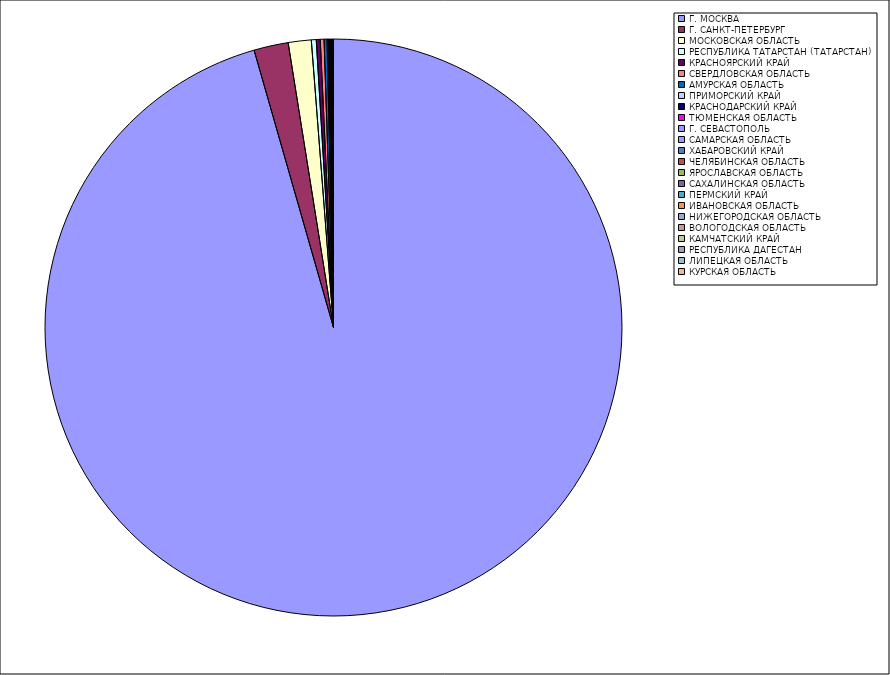
| Category | Оборот |
|---|---|
| Г. МОСКВА | 95.502 |
| Г. САНКТ-ПЕТЕРБУРГ | 1.924 |
| МОСКОВСКАЯ ОБЛАСТЬ | 1.285 |
| РЕСПУБЛИКА ТАТАРСТАН (ТАТАРСТАН) | 0.274 |
| КРАСНОЯРСКИЙ КРАЙ | 0.221 |
| СВЕРДЛОВСКАЯ ОБЛАСТЬ | 0.21 |
| АМУРСКАЯ ОБЛАСТЬ | 0.165 |
| ПРИМОРСКИЙ КРАЙ | 0.054 |
| КРАСНОДАРСКИЙ КРАЙ | 0.046 |
| ТЮМЕНСКАЯ ОБЛАСТЬ | 0.043 |
| Г. СЕВАСТОПОЛЬ | 0.033 |
| САМАРСКАЯ ОБЛАСТЬ | 0.032 |
| ХАБАРОВСКИЙ КРАЙ | 0.026 |
| ЧЕЛЯБИНСКАЯ ОБЛАСТЬ | 0.02 |
| ЯРОСЛАВСКАЯ ОБЛАСТЬ | 0.018 |
| САХАЛИНСКАЯ ОБЛАСТЬ | 0.017 |
| ПЕРМСКИЙ КРАЙ | 0.012 |
| ИВАНОВСКАЯ ОБЛАСТЬ | 0.01 |
| НИЖЕГОРОДСКАЯ ОБЛАСТЬ | 0.009 |
| ВОЛОГОДСКАЯ ОБЛАСТЬ | 0.009 |
| КАМЧАТСКИЙ КРАЙ | 0.007 |
| РЕСПУБЛИКА ДАГЕСТАН | 0.007 |
| ЛИПЕЦКАЯ ОБЛАСТЬ | 0.007 |
| КУРСКАЯ ОБЛАСТЬ | 0.005 |